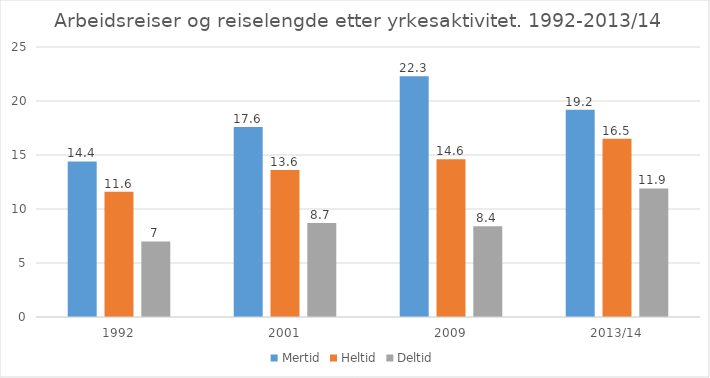
| Category | Mertid | Heltid | Deltid |
|---|---|---|---|
| 1992 | 14.4 | 11.6 | 7 |
| 2001 | 17.6 | 13.6 | 8.7 |
| 2009 | 22.3 | 14.6 | 8.4 |
| 2013/14 | 19.2 | 16.5 | 11.9 |